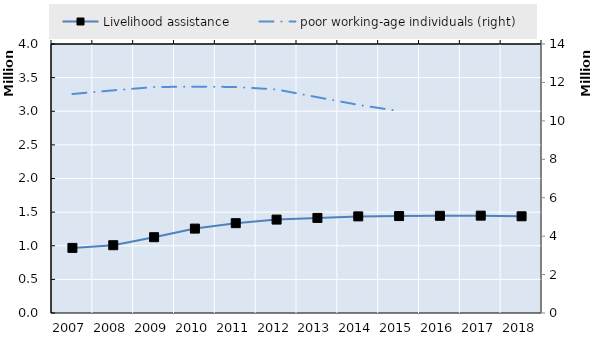
| Category | Livelihood assistance | Series 4 | Series 5 | Series 6 | Series 7 | Series 8 | Series 9 | Series 10 | Series 11 | Series 12 | Series 13 | Series 14 | Series 15 | Series 16 | Series 17 | Series 18 | Series 19 |
|---|---|---|---|---|---|---|---|---|---|---|---|---|---|---|---|---|---|
| 2007.0 | 968017 |  |  |  |  |  |  |  |  |  |  |  |  |  |  |  |  |
| 2008.0 | 1008080 |  |  |  |  |  |  |  |  |  |  |  |  |  |  |  |  |
| 2009.0 | 1127178 |  |  |  |  |  |  |  |  |  |  |  |  |  |  |  |  |
| 2010.0 | 1254992 |  |  |  |  |  |  |  |  |  |  |  |  |  |  |  |  |
| 2011.0 | 1335819 |  |  |  |  |  |  |  |  |  |  |  |  |  |  |  |  |
| 2012.0 | 1388987 |  |  |  |  |  |  |  |  |  |  |  |  |  |  |  |  |
| 2013.0 | 1413891 |  |  |  |  |  |  |  |  |  |  |  |  |  |  |  |  |
| 2014.0 | 1436783 |  |  |  |  |  |  |  |  |  |  |  |  |  |  |  |  |
| 2015.0 | 1441282 |  |  |  |  |  |  |  |  |  |  |  |  |  |  |  |  |
| 2016.0 | 1445170 |  |  |  |  |  |  |  |  |  |  |  |  |  |  |  |  |
| 2017.0 | 1447529 |  |  |  |  |  |  |  |  |  |  |  |  |  |  |  |  |
| 2018.0 | 1438068 |  |  |  |  |  |  |  |  |  |  |  |  |  |  |  |  |